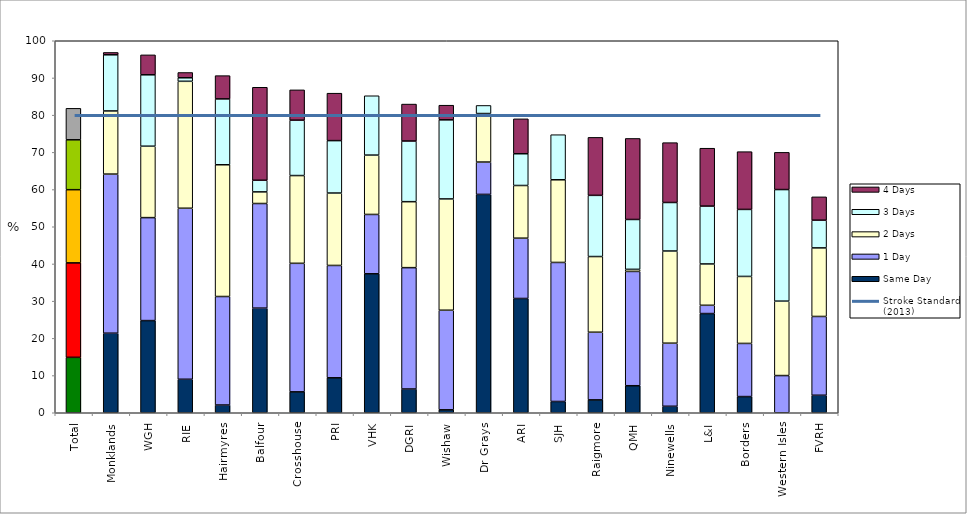
| Category | Same Day | 1 Day | 2 Days | 3 Days | 4 Days |
|---|---|---|---|---|---|
| Total | 14.895 | 25.396 | 19.673 | 13.413 | 8.457 |
| Monklands | 21.384 | 42.767 | 16.981 | 15.094 | 0.629 |
| WGH | 24.777 | 27.679 | 19.196 | 19.196 | 5.357 |
| RIE | 9.005 | 45.972 | 34.123 | 0.948 | 1.422 |
| Hairmyres | 2.083 | 29.167 | 35.417 | 17.708 | 6.25 |
| Balfour | 28.125 | 28.125 | 3.125 | 3.125 | 25 |
| Crosshouse | 5.618 | 34.551 | 23.596 | 14.888 | 8.146 |
| PRI | 9.396 | 30.201 | 19.463 | 14.094 | 12.752 |
| VHK | 37.354 | 15.953 | 15.953 | 15.953 | 0 |
| DGRI | 6.383 | 32.624 | 17.73 | 16.312 | 9.929 |
| Wishaw | 0.787 | 26.772 | 29.921 | 21.26 | 3.937 |
| Dr Grays | 58.696 | 8.696 | 13.043 | 2.174 | 0 |
| ARI | 30.717 | 16.212 | 14.164 | 8.532 | 9.386 |
| SJH | 3.03 | 37.374 | 22.222 | 12.121 | 0 |
| Raigmore | 3.463 | 18.182 | 20.346 | 16.45 | 15.584 |
| QMH | 7.263 | 30.726 | 0.559 | 13.408 | 21.788 |
| Ninewells | 1.739 | 16.957 | 24.783 | 13.043 | 16.087 |
| L&I | 26.667 | 2.222 | 11.111 | 15.556 | 15.556 |
| Borders | 4.348 | 14.286 | 18.012 | 18.012 | 15.528 |
| Western Isles | 0 | 10 | 20 | 30 | 10 |
| FVRH | 4.706 | 21.176 | 18.431 | 7.451 | 6.275 |